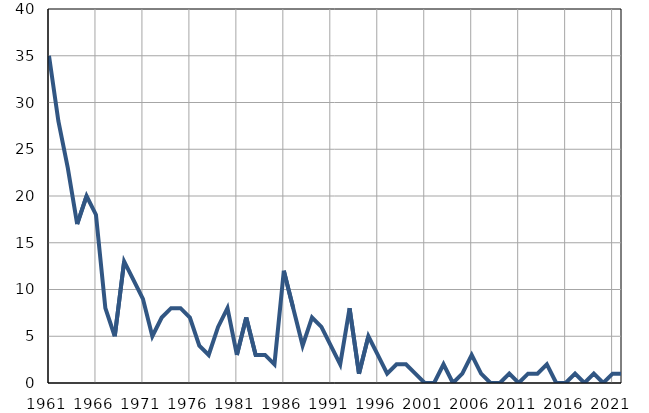
| Category | Умрла 
одојчад |
|---|---|
| 1961.0 | 35 |
| 1962.0 | 28 |
| 1963.0 | 23 |
| 1964.0 | 17 |
| 1965.0 | 20 |
| 1966.0 | 18 |
| 1967.0 | 8 |
| 1968.0 | 5 |
| 1969.0 | 13 |
| 1970.0 | 11 |
| 1971.0 | 9 |
| 1972.0 | 5 |
| 1973.0 | 7 |
| 1974.0 | 8 |
| 1975.0 | 8 |
| 1976.0 | 7 |
| 1977.0 | 4 |
| 1978.0 | 3 |
| 1979.0 | 6 |
| 1980.0 | 8 |
| 1981.0 | 3 |
| 1982.0 | 7 |
| 1983.0 | 3 |
| 1984.0 | 3 |
| 1985.0 | 2 |
| 1986.0 | 12 |
| 1987.0 | 8 |
| 1988.0 | 4 |
| 1989.0 | 7 |
| 1990.0 | 6 |
| 1991.0 | 4 |
| 1992.0 | 2 |
| 1993.0 | 8 |
| 1994.0 | 1 |
| 1995.0 | 5 |
| 1996.0 | 3 |
| 1997.0 | 1 |
| 1998.0 | 2 |
| 1999.0 | 2 |
| 2000.0 | 1 |
| 2001.0 | 0 |
| 2002.0 | 0 |
| 2003.0 | 2 |
| 2004.0 | 0 |
| 2005.0 | 1 |
| 2006.0 | 3 |
| 2007.0 | 1 |
| 2008.0 | 0 |
| 2009.0 | 0 |
| 2010.0 | 1 |
| 2011.0 | 0 |
| 2012.0 | 1 |
| 2013.0 | 1 |
| 2014.0 | 2 |
| 2015.0 | 0 |
| 2016.0 | 0 |
| 2017.0 | 1 |
| 2018.0 | 0 |
| 2019.0 | 1 |
| 2020.0 | 0 |
| 2021.0 | 1 |
| 2022.0 | 1 |